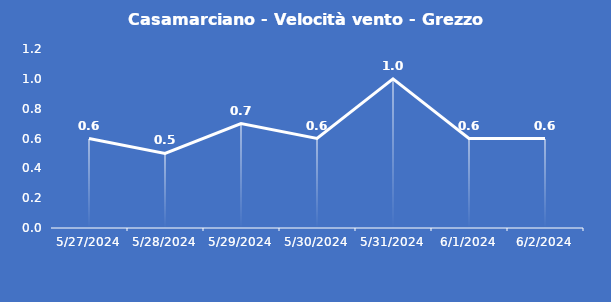
| Category | Casamarciano - Velocità vento - Grezzo (m/s) |
|---|---|
| 5/27/24 | 0.6 |
| 5/28/24 | 0.5 |
| 5/29/24 | 0.7 |
| 5/30/24 | 0.6 |
| 5/31/24 | 1 |
| 6/1/24 | 0.6 |
| 6/2/24 | 0.6 |